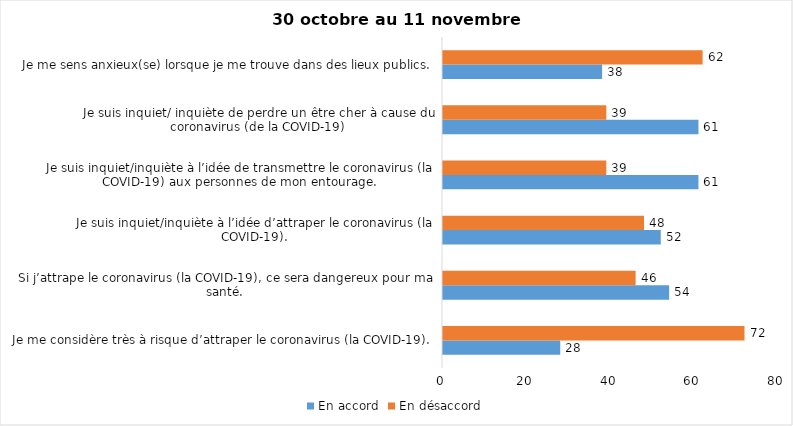
| Category | En accord | En désaccord |
|---|---|---|
| Je me considère très à risque d’attraper le coronavirus (la COVID-19). | 28 | 72 |
| Si j’attrape le coronavirus (la COVID-19), ce sera dangereux pour ma santé. | 54 | 46 |
| Je suis inquiet/inquiète à l’idée d’attraper le coronavirus (la COVID-19). | 52 | 48 |
| Je suis inquiet/inquiète à l’idée de transmettre le coronavirus (la COVID-19) aux personnes de mon entourage. | 61 | 39 |
| Je suis inquiet/ inquiète de perdre un être cher à cause du coronavirus (de la COVID-19) | 61 | 39 |
| Je me sens anxieux(se) lorsque je me trouve dans des lieux publics. | 38 | 62 |